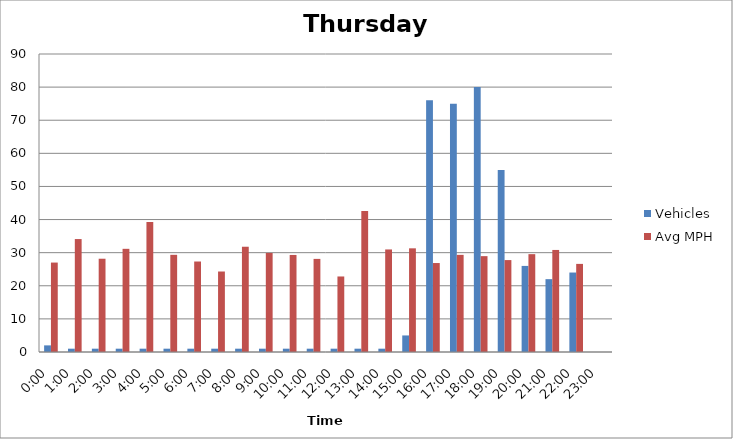
| Category | Vehicles | Avg MPH |
|---|---|---|
| 0:00 | 2 | 27.01 |
| 1:00 | 1 | 34.11 |
| 2:00 | 1 | 28.17 |
| 3:00 | 1 | 31.16 |
| 4:00 | 1 | 39.23 |
| 5:00 | 1 | 29.35 |
| 6:00 | 1 | 27.33 |
| 7:00 | 1 | 24.31 |
| 8:00 | 1 | 31.79 |
| 9:00 | 1 | 29.92 |
| 10:00 | 1 | 29.31 |
| 11:00 | 1 | 28.12 |
| 12:00 | 1 | 22.81 |
| 13:00 | 1 | 42.61 |
| 14:00 | 1 | 30.97 |
| 15:00 | 5 | 31.31 |
| 16:00 | 76 | 26.87 |
| 17:00 | 75 | 29.34 |
| 18:00 | 80 | 28.95 |
| 19:00 | 55 | 27.76 |
| 20:00 | 26 | 29.55 |
| 21:00 | 22 | 30.82 |
| 22:00 | 24 | 26.61 |
| 23:00 | 0 | 0 |